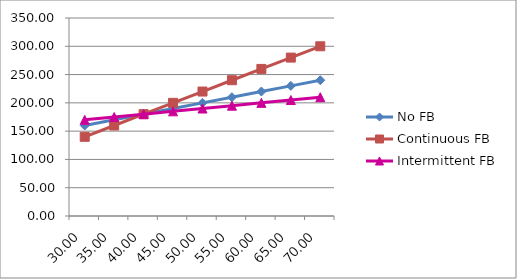
| Category | No FB | Continuous FB | Intermittent FB |
|---|---|---|---|
| 30.0 | 160 | 140 | 170 |
| 35.0 | 170 | 160 | 175 |
| 40.0 | 180 | 180 | 180 |
| 45.0 | 190 | 200 | 185 |
| 50.0 | 200 | 220 | 190 |
| 55.0 | 210 | 240 | 195 |
| 60.0 | 220 | 260 | 200 |
| 65.0 | 230 | 280 | 205 |
| 70.0 | 240 | 300 | 210 |